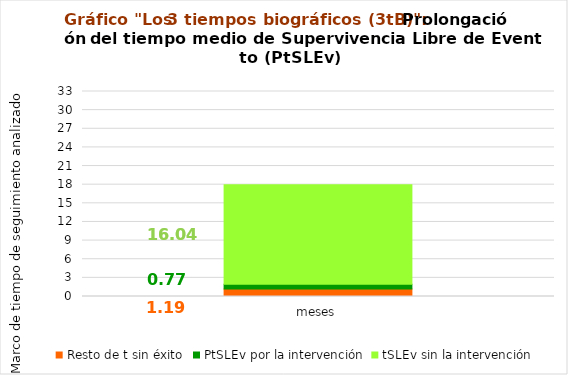
| Category | Resto de t sin éxito | PtSLEv por la intervención | tSLEv sin la intervención |
|---|---|---|---|
| meses | 1.193 | 0.767 | 16.04 |